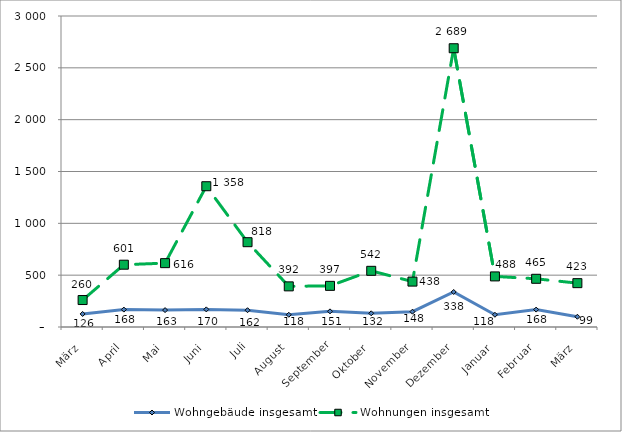
| Category | Wohngebäude insgesamt | Wohnungen insgesamt |
|---|---|---|
| März | 126 | 260 |
| April | 168 | 601 |
| Mai | 163 | 616 |
| Juni | 170 | 1358 |
| Juli | 162 | 818 |
| August | 118 | 392 |
| September | 151 | 397 |
| Oktober | 132 | 542 |
| November | 148 | 438 |
| Dezember | 338 | 2689 |
| Januar | 118 | 488 |
| Februar | 168 | 465 |
| März | 99 | 423 |